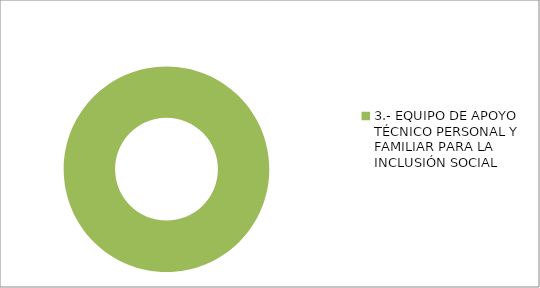
| Category | Series 0 |
|---|---|
| 3.- EQUIPO DE APOYO TÉCNICO PERSONAL Y FAMILIAR PARA LA INCLUSIÓN SOCIAL | 5 |